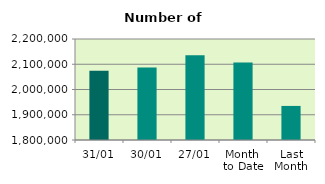
| Category | Series 0 |
|---|---|
| 31/01 | 2074332 |
| 30/01 | 2087076 |
| 27/01 | 2135236 |
| Month 
to Date | 2107310.455 |
| Last
Month | 1934937.048 |